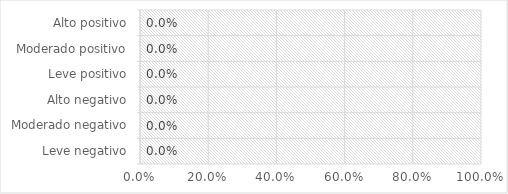
| Category | Series 0 |
|---|---|
| Leve negativo | 0 |
| Moderado negativo | 0 |
| Alto negativo | 0 |
| Leve positivo | 0 |
| Moderado positivo | 0 |
| Alto positivo | 0 |